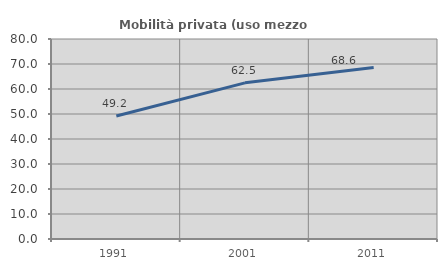
| Category | Mobilità privata (uso mezzo privato) |
|---|---|
| 1991.0 | 49.21 |
| 2001.0 | 62.465 |
| 2011.0 | 68.587 |